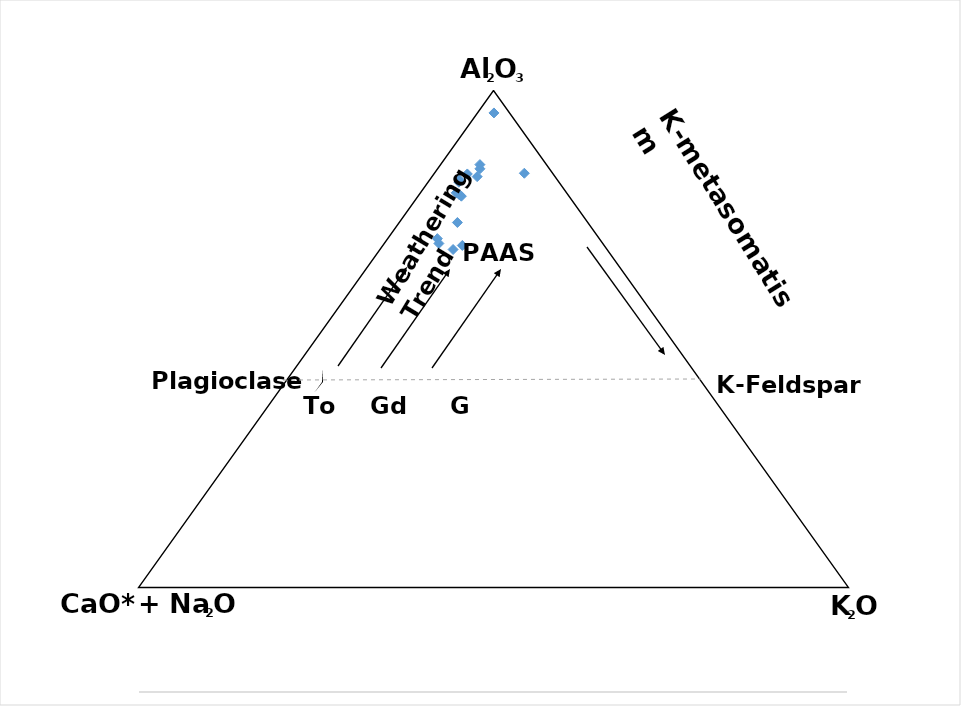
| Category | Series 0 |
|---|---|
| 0.5442369091900703 | 0.6 |
| 0.4235619882966104 | 0.519 |
| 0.44972549747427687 | 0.543 |
| 0.447991717912383 | 0.577 |
| 0.4566650297164018 | 0.516 |
| 0.4436317785248244 | 0.512 |
| 0.4214012524063892 | 0.524 |
| 0.47761464563666356 | 0.596 |
| 0.4553020193210428 | 0.573 |
| 0.4525130267378516 | 0.592 |
| 0.45183166775001565 | 0.589 |
| 0.4815320195355336 | 0.605 |
| 0.46370394354299893 | 0.599 |
| 0.4815028878806951 | 0.61 |
| 0.5013447825391086 | 0.669 |
| 0.45217581572041043 | 0.575 |